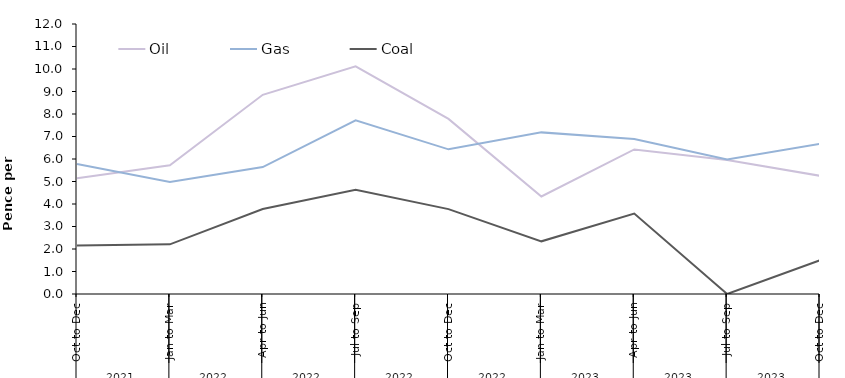
| Category | Oil | Gas | Coal |
|---|---|---|---|
| 0 | 5.145 | 5.777 | 2.161 |
| 1 | 5.722 | 4.981 | 2.207 |
| 2 | 8.854 | 5.643 | 3.775 |
| 3 | 10.118 | 7.716 | 4.628 |
| 4 | 7.783 | 6.429 | 3.773 |
| 5 | 4.333 | 7.183 | 2.341 |
| 6 | 6.424 | 6.888 | 3.574 |
| 7 | 5.951 | 5.977 | 0 |
| 8 | 5.253 | 6.675 | 1.501 |